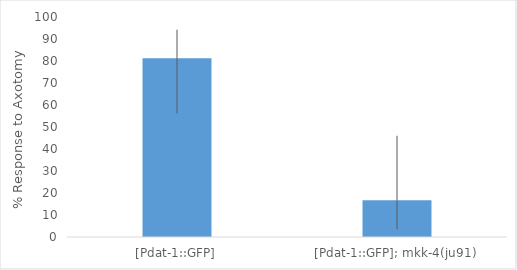
| Category | Series 0 |
|---|---|
| [Pdat-1::GFP] | 81.25 |
| [Pdat-1::GFP]; mkk-4(ju91) | 16.667 |